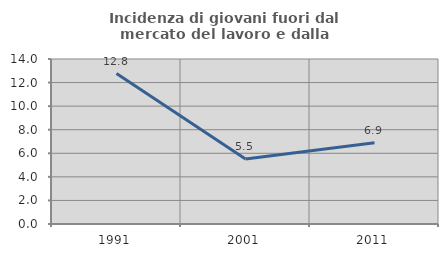
| Category | Incidenza di giovani fuori dal mercato del lavoro e dalla formazione  |
|---|---|
| 1991.0 | 12.766 |
| 2001.0 | 5.512 |
| 2011.0 | 6.897 |